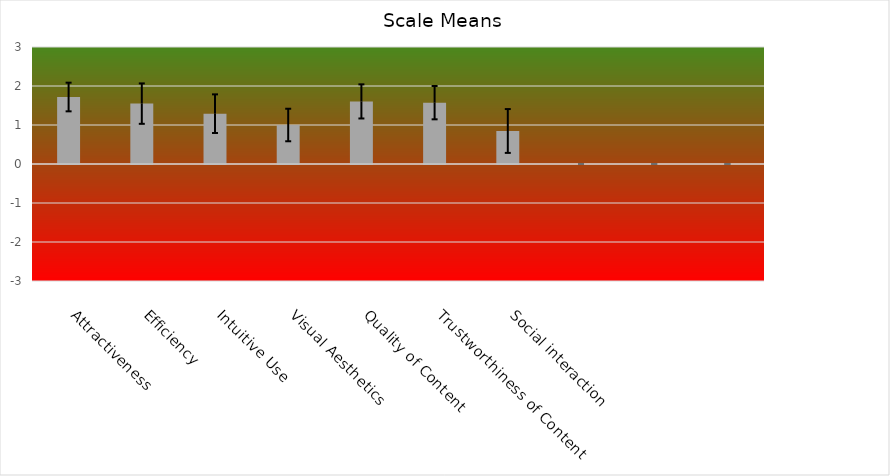
| Category | Series 0 |
|---|---|
| Attractiveness | 1.718 |
| Efficiency | 1.548 |
| Intuitive Use | 1.29 |
| Visual Aesthetics | 1 |
| Quality of Content | 1.605 |
| Trustworthiness of Content | 1.573 |
| Social interaction | 0.847 |